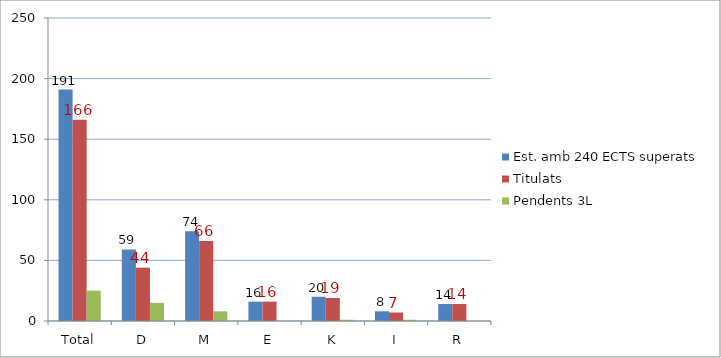
| Category | Est. amb 240 ECTS superats | Titulats | Pendents 3L |
|---|---|---|---|
| Total | 191 | 166 | 25 |
| D | 59 | 44 | 15 |
| M | 74 | 66 | 8 |
| E | 16 | 16 | 0 |
| K | 20 | 19 | 1 |
| I | 8 | 7 | 1 |
| R | 14 | 14 | 0 |